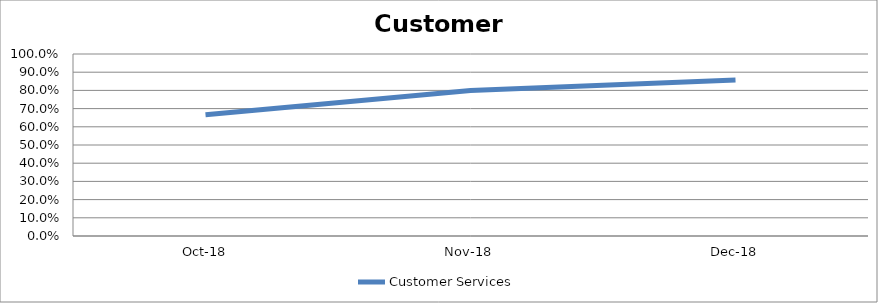
| Category | Customer Services |
|---|---|
| 2018-10-01 | 0.667 |
| 2018-11-01 | 0.8 |
| 2018-12-01 | 0.857 |